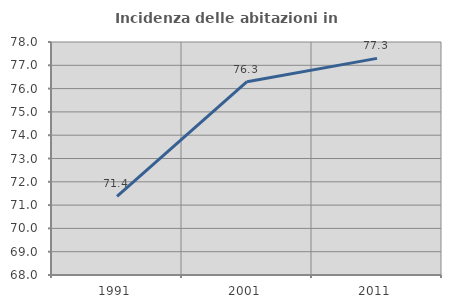
| Category | Incidenza delle abitazioni in proprietà  |
|---|---|
| 1991.0 | 71.375 |
| 2001.0 | 76.298 |
| 2011.0 | 77.298 |